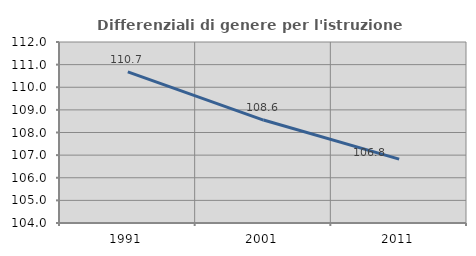
| Category | Differenziali di genere per l'istruzione superiore |
|---|---|
| 1991.0 | 110.682 |
| 2001.0 | 108.55 |
| 2011.0 | 106.824 |